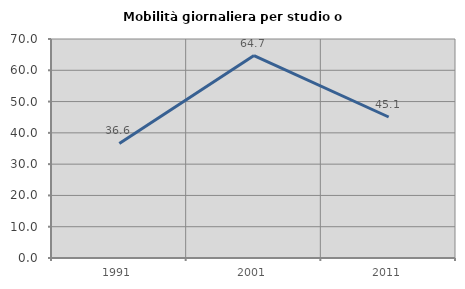
| Category | Mobilità giornaliera per studio o lavoro |
|---|---|
| 1991.0 | 36.634 |
| 2001.0 | 64.706 |
| 2011.0 | 45.07 |